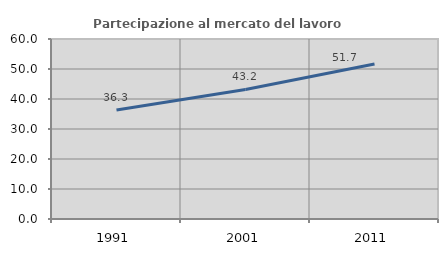
| Category | Partecipazione al mercato del lavoro  femminile |
|---|---|
| 1991.0 | 36.349 |
| 2001.0 | 43.187 |
| 2011.0 | 51.652 |